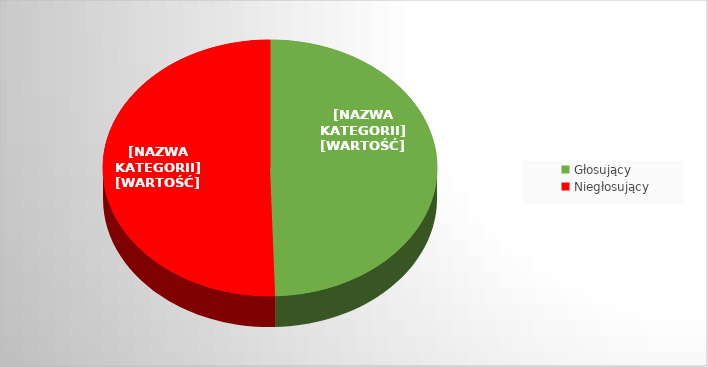
| Category | Series 0 |
|---|---|
| Głosujący | 0.495 |
| Niegłosujący | 0.505 |